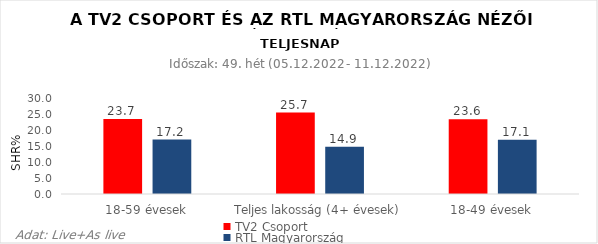
| Category | TV2 Csoport | RTL Magyarország |
|---|---|---|
| 18-59 évesek | 23.7 | 17.2 |
| Teljes lakosság (4+ évesek) | 25.7 | 14.9 |
| 18-49 évesek | 23.6 | 17.1 |